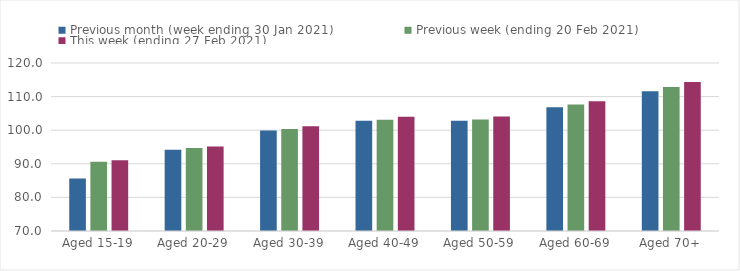
| Category | Previous month (week ending 30 Jan 2021) | Previous week (ending 20 Feb 2021) | This week (ending 27 Feb 2021) |
|---|---|---|---|
| Aged 15-19 | 85.65 | 90.59 | 91.07 |
| Aged 20-29 | 94.16 | 94.71 | 95.13 |
| Aged 30-39 | 99.94 | 100.33 | 101.19 |
| Aged 40-49 | 102.81 | 103.14 | 103.98 |
| Aged 50-59 | 102.83 | 103.17 | 104.08 |
| Aged 60-69 | 106.85 | 107.62 | 108.63 |
| Aged 70+ | 111.59 | 112.86 | 114.36 |